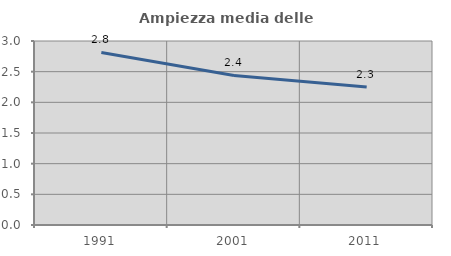
| Category | Ampiezza media delle famiglie |
|---|---|
| 1991.0 | 2.814 |
| 2001.0 | 2.438 |
| 2011.0 | 2.25 |